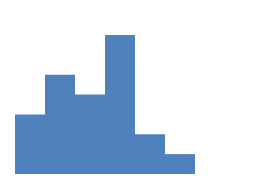
| Category | Series 0 |
|---|---|
| 20,25 | 3 |
| 24,25 | 5 |
| 28,25 | 4 |
| 32,25 | 7 |
| 36,25 | 2 |
| 40,25 | 1 |